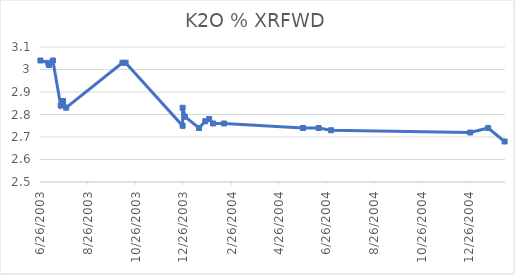
| Category | K2O % XRFWD |
|---|---|
| 6/26/03 | 3.04 |
| 7/6/03 | 3.03 |
| 7/7/03 | 3.02 |
| 7/12/03 | 3.04 |
| 7/22/03 | 2.84 |
| 7/25/03 | 2.86 |
| 7/29/03 | 2.83 |
| 10/9/03 | 3.03 |
| 10/13/03 | 3.03 |
| 12/25/03 | 2.75 |
| 12/25/03 | 2.83 |
| 12/28/03 | 2.79 |
| 1/15/04 | 2.74 |
| 1/23/04 | 2.77 |
| 1/28/04 | 2.78 |
| 2/2/04 | 2.76 |
| 2/16/04 | 2.76 |
| 5/27/04 | 2.74 |
| 6/16/04 | 2.74 |
| 7/2/04 | 2.73 |
| 12/27/04 | 2.72 |
| 1/19/05 | 2.74 |
| 2/9/05 | 2.68 |